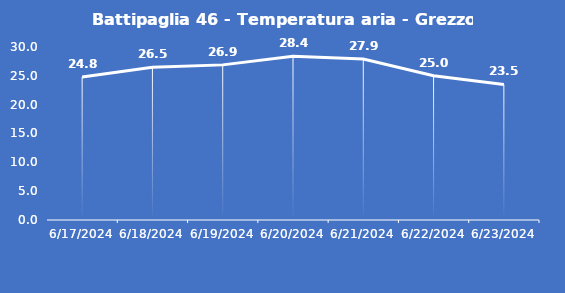
| Category | Battipaglia 46 - Temperatura aria - Grezzo (°C) |
|---|---|
| 6/17/24 | 24.8 |
| 6/18/24 | 26.5 |
| 6/19/24 | 26.9 |
| 6/20/24 | 28.4 |
| 6/21/24 | 27.9 |
| 6/22/24 | 25 |
| 6/23/24 | 23.5 |